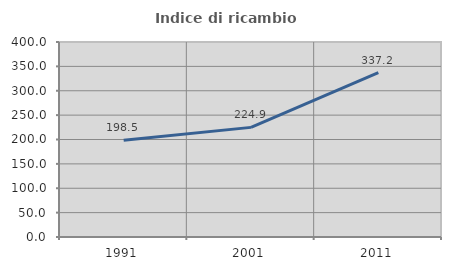
| Category | Indice di ricambio occupazionale  |
|---|---|
| 1991.0 | 198.485 |
| 2001.0 | 224.878 |
| 2011.0 | 337.179 |